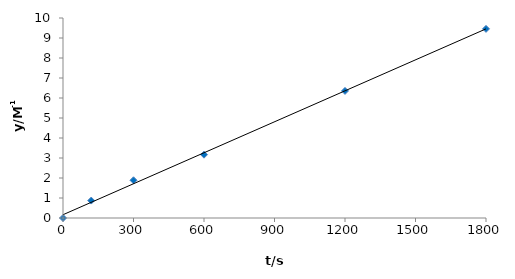
| Category | Series 0 |
|---|---|
| 0.0 | 0 |
| 120.0 | 0.871 |
| 300.0 | 1.887 |
| 600.0 | 3.166 |
| 1200.0 | 6.354 |
| 1800.0 | 9.457 |